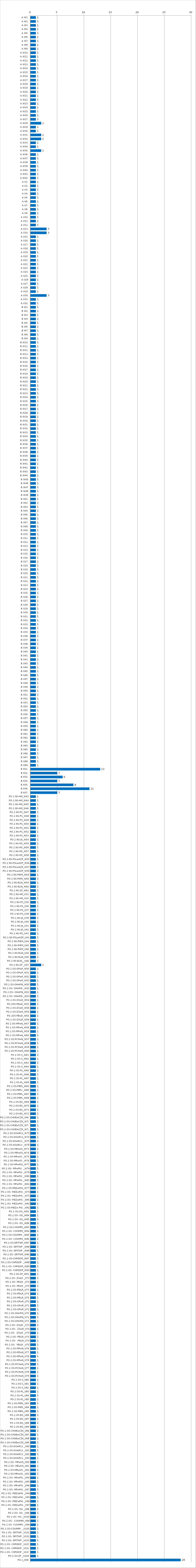
| Category | Series 0 |
|---|---|
| A.W1. | 1 |
| A.W2. | 1 |
| A.W3. | 1 |
| A.W4. | 1 |
| A.W5. | 1 |
| A.W6. | 1 |
| A.W7. | 1 |
| A.W8. | 1 |
| A.W9. | 1 |
| A.W10. | 1 |
| A.W11. | 1 |
| A.W12. | 1 |
| A.W13. | 1 |
| A.W14. | 1 |
| A.W15. | 1 |
| A.W16. | 1 |
| A.W17. | 1 |
| A.W18. | 1 |
| A.W19. | 1 |
| A.W20. | 1 |
| A.W21. | 1 |
| A.W22. | 1 |
| A.W23. | 1 |
| A.W24. | 1 |
| A.W25. | 1 |
| A.W26. | 1 |
| A.W27. | 1 |
| A.W28. | 2 |
| A.W29. | 1 |
| A.W30. | 1 |
| A.W31. | 2 |
| A.W32. | 2 |
| A.W33. | 1 |
| A.W34. | 1 |
| A.W35. | 2 |
| A.W36. | 1 |
| A.W37. | 1 |
| A.W38. | 1 |
| A.W39. | 1 |
| A.W40. | 1 |
| A.W41. | 1 |
| A.W42. | 1 |
| A.U1. | 1 |
| A.U2. | 1 |
| A.U3. | 1 |
| A.U4. | 1 |
| A.U5. | 1 |
| A.U6. | 1 |
| A.U7. | 1 |
| A.U8. | 1 |
| A.U9. | 1 |
| A.U10. | 1 |
| A.U11. | 1 |
| A.U12. | 1 |
| A.U13. | 3 |
| A.U14. | 3 |
| A.U15. | 1 |
| A.U16. | 1 |
| A.U17. | 1 |
| A.U18. | 1 |
| A.U19. | 1 |
| A.U20. | 1 |
| A.U21. | 1 |
| A.U22. | 1 |
| A.U23. | 1 |
| A.U24. | 1 |
| A.U25. | 1 |
| A.U26 | 1 |
| A.U27. | 1 |
| A.U28. | 1 |
| A.U29. | 1 |
| A.U30. | 3 |
| A.U31. | 1 |
| A.U32. | 1 |
| B.W1. | 1 |
| B.W2. | 1 |
| B.W3. | 1 |
| B.W4. | 1 |
| B.W5. | 1 |
| B.W6. | 1 |
| B.W7. | 1 |
| B.W8. | 1 |
| B.W9. | 1 |
| B.W10. | 1 |
| B.W11. | 1 |
| B.W12. | 1 |
| B.W13. | 1 |
| B.W14. | 1 |
| B.W15. | 1 |
| B.W16. | 1 |
| B.W17. | 1 |
| B.W18. | 1 |
| B.W19. | 1 |
| B.W20. | 1 |
| B.W21. | 1 |
| B.W22. | 1 |
| B.W23. | 1 |
| B.W24. | 1 |
| B.W25. | 1 |
| B.W26. | 1 |
| B.W27. | 1 |
| B.W28. | 1 |
| B.W29. | 1 |
| B.W30. | 1 |
| B.W31. | 1 |
| B.W32. | 1 |
| B.W33. | 1 |
| B.W34. | 1 |
| B.W35. | 1 |
| B.W36. | 1 |
| B.W37. | 1 |
| B.W38. | 1 |
| B.W39. | 1 |
| B.W40. | 1 |
| B.W41. | 1 |
| B.W42. | 1 |
| B.W43. | 1 |
| B.W44. | 1 |
| B.W45 | 1 |
| B.W46 | 1 |
| B.W47 | 1 |
| B.W48 | 1 |
| B.W49 | 1 |
| B.U01. | 1 |
| B.U02. | 1 |
| B.U03. | 1 |
| B.U04. | 1 |
| B.U05. | 1 |
| B.U06. | 1 |
| B.U07. | 1 |
| B.U08. | 1 |
| B.U09. | 1 |
| B.U10. | 1 |
| B.U11. | 1 |
| B.U12. | 1 |
| B.U13. | 1 |
| B.U14. | 1 |
| B.U15. | 1 |
| B.U16. | 1 |
| B.U17. | 1 |
| B.U18. | 1 |
| B.U19. | 1 |
| B.U20. | 1 |
| B.U21. | 1 |
| B.U22. | 1 |
| B.U23. | 1 |
| B.U24. | 1 |
| B.U25. | 1 |
| B.U26. | 1 |
| B.U27. | 1 |
| B.U28. | 1 |
| B.U29. | 1 |
| B.U30. | 1 |
| B.U31. | 1 |
| B.U32. | 1 |
| B.U33. | 1 |
| B.U34. | 1 |
| B.U35. | 1 |
| B.U36. | 1 |
| B.U37. | 1 |
| B.U38. | 1 |
| B.U39. | 1 |
| B.U40. | 1 |
| B.U41. | 1 |
| B.U42. | 1 |
| B.U43. | 1 |
| B.U44. | 1 |
| B.U45. | 1 |
| B.U46. | 1 |
| B.U47. | 1 |
| B.U48. | 1 |
| B.U49. | 1 |
| B.U50. | 1 |
| B.U51. | 1 |
| B.U52. | 1 |
| B.U53. | 1 |
| B.U54. | 1 |
| B.U55. | 1 |
| B.U56. | 1 |
| B.U57. | 1 |
| B.U58. | 1 |
| B.U59. | 1 |
| B.U60. | 1 |
| B.U61. | 1 |
| B.U62. | 1 |
| B.U63. | 1 |
| B.U64. | 1 |
| B.U65. | 1 |
| B.U66. | 1 |
| B.U67. | 1 |
| B.U68. | 1 |
| B.U69. | 1 |
| B.K01. | 13 |
| B.K02. | 5 |
| B.K03. | 6 |
| B.K04. | 5 |
| B.K05. | 8 |
| B.K06. | 11 |
| B.K07. | 5 |
| PO.2.NS-HM_W43 | 1 |
| PO.2.NS-HM_W44 | 1 |
| PO.2.NS-HM_W45 | 1 |
| PO.2.NS-HM_W46 | 1 |
| PO.2.NS-PS_W47 | 1 |
| PO.2.NS-PS_W48 | 1 |
| PO.2.NS-PS_W49 | 1 |
| PO.2.NS-PS_W50 | 1 |
| PO.2.NS-PS_W51 | 1 |
| PO.2.NS-PS_W52 | 1 |
| PO.2.NS-PS_W53 | 1 |
| PO.2.NS-JA_W54 | 1 |
| PO.2.NS-MS_W55 | 1 |
| PO.2.NS-MS_W56 | 1 |
| PO.2.NS-MS_W57 | 1 |
| PO.2.NS-MS_W58 | 1 |
| PO.2.NS-PSLwAZP_W55 | 1 |
| PO.2.NS-PSLwAZP_W56 | 1 |
| PO.2.NS-PSLwAZP_W57 | 1 |
| PO.2.NS-PSLwAZP_W58 | 1 |
| PO.2.NS-PiRM_W59 | 1 |
| PO.2.NS-PiRM_W60 | 1 |
| PO.2.NS-ELiN_W59 | 1 |
| PO.2.NS-ELiN_W60 | 1 |
| PO.2.NS-ZF_W61 | 1 |
| PO.2.NS-HM_U33 | 1 |
| PO.2.NS-HM_U34 | 1 |
| PO.2.NS-PS_U35 | 1 |
| PO.2.NS-PS_U36 | 1 |
| PO.2.NS-PS_U37 | 1 |
| PO.2.NS-PS_U38 | 1 |
| PO.2.NS-JA_U39 | 1 |
| PO.2.NS-JA_U40 | 1 |
| PO.2.NS-JA_U41 | 1 |
| PO.2.NS-JA_U42 | 1 |
| PO.2.NS-MS_U43 | 1 |
| PO.2.NS-PSLwAZP_U43 | 1 |
| PO.2.NS-PiRM_U44 | 1 |
| PO.2.NS-PiRM_U45 | 1 |
| PO.2.NS-PiRM_U46 | 1 |
| PO.2.NS-ELiN_U44 | 1 |
| PO.2.NS-ELiN_U45 | 1 |
| PO.2.NS-ELiN__U46 | 1 |
| PO.2.NS-ZF _U47 | 2 |
| PO.2.OS-OPwP_W50 | 1 |
| PO.2.OS-OPwP_W51 | 1 |
| PO.2.OS-OPwP_W52 | 1 |
| PO.2.OS-OPwP_W53 | 1 |
| PO.2.OS-OHnPiN_W50 | 1 |
| PO.2.OS- OHnPiN _W51 | 1 |
| PO.2.OS- OHnPiN_W52 | 1 |
| PO.2.OS- OHnPiN _W53 | 1 |
| PO.2.OS-ZSiLR_W54 | 1 |
| PO.2OS-PEiLR_W55 | 1 |
| PO.2.OS-ZSiLR_W56 | 1 |
| PO.2.OS-ZSiLR_W54 | 1 |
| PO.2OS-PEiLR_W55 | 1 |
| PO.2.OS-ZSiLR_W56 | 1 |
| PO.2.OS-MPwN_W57 | 1 |
| PO.2.OS-MPwN_W58 | 1 |
| PO.2.OS-MPwN_W59 | 1 |
| PO.2.OS-MPwN_W60 | 1 |
| PO.2.OS-PCHwN_W57 | 1 |
| PO.2.OS-PCHwN_W58 | 1 |
| PO.2.OS-PCHwN_W59 | 1 |
| PO.2.OS-PCHwN_W60 | 1 |
| PO.2.OS-S_W61 | 1 |
| PO.2.OS-S_W62 | 1 |
| PO.2.OS-S_W63 | 1 |
| PO.2.OS-S_W64 | 1 |
| PO.2.OS-PL_W65 | 1 |
| PO.2.OS-PL_W66 | 1 |
| PO.2.OS-PL_W67 | 1 |
| PO.2.OS-PL_W68 | 1 |
| PO.2.OS-PItPL_W65 | 1 |
| PO.2.OS-PItPL-_W66 | 1 |
| PO.2.OS-PItPL_W67 | 1 |
| PO.2.OS-PItPL_W68 | 1 |
| PO.2.OS-EG_W69 | 1 |
| PO.2.OS-EG_W70 | 1 |
| PO.2.OS-EG_W71 | 1 |
| PO.2.OS-EG_W72 | 1 |
| PO.2.OS-CHUEwCŻK_W69 | 1 |
| PO.2.OS-CHUEwCŻK_W70 | 1 |
| PO.2.OS-CHUEwCŻK_W71 | 1 |
| PO.2.OS-CHUEwCŻK_W72 | 1 |
| PO.2.OS-KiSARCz_W73 | 1 |
| PO.2.OS-KiSARCz_W74 | 1 |
| PO.2.OS-KiSARCz _W75 | 1 |
| PO.2.OS-KiSARCz _W76 | 1 |
| PO.2.OS-MRwUS_W73 | 1 |
| PO.2.OS-MRwUS_W74 | 1 |
| PO.2.OS-MRwUS _W75 | 1 |
| PO.2.OS-MRwUS _W76 | 1 |
| PO.2.OS-MPwPiG_W77 | 1 |
| PO.2.OS- MPwPiG  _W78 | 1 |
| PO.2.OS- MPwPiG _W79 | 1 |
| PO.2.OS- MPwPiG _W80 | 1 |
| PO.2.OS- MPwPiG _W81 | 1 |
| PO.2.OS- MPwPiG _W82 | 1 |
| PO.2.OS-PiEZwPiG_W77 | 1 |
| PO.2.OS- PiEZwPiG _W78 | 1 |
| PO.2.OS- PiEZwPiG _W79 | 1 |
| PO.2.OS- PiEZwPiG _W80 | 1 |
| PO.2.OS- PiEZwPiG _W81 | 1 |
| PO.2.OS-PiEZw PiG _W82 | 1 |
| PO.2.OS-OG_W83 | 1 |
| PO.2.OS- OG_W84 | 1 |
| PO.2.OS- OG_W85 | 1 |
| PO.2.OS- OG_W86 | 1 |
| PO.2.OS-COUMPK_W83 | 1 |
| PO.2.OS- COUMPK_W84 | 1 |
| PO.2.OS-COUMPK _W85 | 1 |
| PO.2.OS- COUMPK_W86 | 1 |
| PO.2.OS-DPiTWP_W87 | 1 |
| PO.2.OS- DPiTWP _W88 | 1 |
| PO.2.OS- DPiTWP _W89 | 1 |
| PO.2.OS- DPiTWP_W90 | 1 |
| PO.2.OS-CHPiDOP_W87 | 1 |
| PO.2.OS-CHPiDOP  _W88 | 1 |
| PO.2.OS- CHPiDOP_W89 | 1 |
| PO.2.OS- CHPiDOP_W90 | 1 |
| PO.2.OS-ZF_W91 | 1 |
| PO.2.OS- ZSiLR _U73 | 1 |
| PO.2.OS- PEiLR _U74 | 1 |
| PO.2.OS- PEiLR _U75 | 1 |
| PO.2.OS-PEiLR_U73 | 1 |
| PO.2.OS-PEiLR_U74 | 1 |
| PO.2.OS-PEiLR_U75 | 1 |
| PO.2.OS-OPwP_U70 | 1 |
| PO.2.OS-OPwP_U71 | 1 |
| PO.2.OS-OPwP_U72 | 1 |
| PO.2.OS-OHnPiN_U70 | 1 |
| PO.2.OS-OHnPiN_U71 | 1 |
| PO.2.OS-OHnPiN_U72 | 1 |
| PO.2.OS- ZSiLR _U73 | 1 |
| PO.2.OS-  ZSiLR_U74 | 1 |
| PO.2.OS-  ZSiLR _U75 | 1 |
| PO.2.OS- PEiLR_U73 | 1 |
| PO.2.OS-  PEiLR_U74 | 1 |
| PO.2.OS-  PEiLR _U75 | 1 |
| PO.2.OS-MPwN_U76 | 1 |
| PO.2.OS-MPwN_U77 | 1 |
| PO.2.OS-MPwN_U78 | 1 |
| PO.2.OS-MPwN_U79 | 1 |
| PO.2.OS-PCHwN_U76 | 1 |
| PO.2.OS-PCHwN_U77 | 1 |
| PO.2.OS-PCHwN_U78 | 1 |
| PO.2.OS-PCHwN_U79 | 1 |
| PO.2.OS-S_U80 | 1 |
| PO.2.OS-S_U81 | 1 |
| PO.2.OS-S_U82 | 1 |
| PO.2.OS-PL_U83 | 1 |
| PO.2.OS-PL_U84 | 1 |
| PO.2.OS-PL_U85 | 1 |
| PO.2.OS-PItPL_U83 | 1 |
| PO.2.OS-PItPL_U84 | 1 |
| PO.2.OS-PItPL_U85 | 1 |
| PO.2.OS-EG_U86 | 1 |
| PO.2.OS-EG_U87 | 1 |
| PO.2.OS-EG_U88 | 1 |
| PO.2.OS-EG_U89 | 1 |
| PO.2.OS-CHUEwCŻK_U86 | 1 |
| PO.2.OS-CHUEwCŻK_U87 | 1 |
| PO.2.OS-CHUEwCŻK_U88 | 1 |
| PO.2.OS-CHUEwCŻK_U89 | 1 |
| PO.2.OS-KiSARCz _U90 | 1 |
| PO.2.OS-KiSARCz _U91 | 1 |
| PO.2.OS-KiSARCz _U92 | 1 |
| PO.2.OS-KiSARCz _U93 | 1 |
| PO.2.OS- MRwUS_U90 | 1 |
| PO.2.OS- MRwUS_U91 | 1 |
| PO.2.OS-MRwUS _U92 | 1 |
| PO.2.OS-MRwUS _U93 | 1 |
| PO.2.OS- MPwPiG _U94 | 1 |
| PO.2.OS- MPwPiG _U95 | 1 |
| PO.2.OS- MPwPiG _U96 | 1 |
| PO.2.OS- MPwPiG _U97 | 1 |
| PO.2.OS- PiEZwPiG _U94 | 1 |
| PO.2.OS- PiEZwPiG _U95 | 1 |
| PO.2.OS- PiEZwPiG _U96 | 1 |
| PO.2.OS- PiEZwPiG _U97 | 1 |
| PO.2.OS- OG _U98 | 1 |
| PO.2.OS- OG _U99 | 1 |
| PO.2.OS- OG _U100 | 1 |
| PO.2.OS-  COUMPK_U98 | 1 |
| PO.2.OS- COUMPK _U99 | 1 |
| PO.2.OS-COUMPK  _U100 | 1 |
| PO.2.OS- DPiTWP _U101 | 1 |
| PO.2.OS- DPiTWP _U102 | 1 |
| PO.2.OS- DPiTWP _U103 | 1 |
| PO.2.OS- CHPiDOP _U101 | 1 |
| PO.2.OS- CHPiDOP _U102 | 1 |
| PO.2.OS- CHPiDOP _U103 | 1 |
| PO.2.OS-ZF _U104 | 1 |
| PO.2_K08 | 28 |